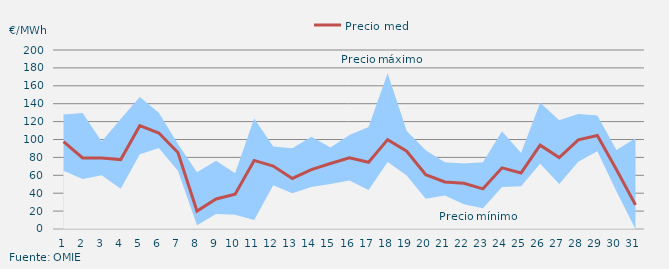
| Category | Precio medio |
|---|---|
| 1.0 | 97.749 |
| 2.0 | 79.348 |
| 3.0 | 79.367 |
| 4.0 | 77.556 |
| 5.0 | 115.408 |
| 6.0 | 107.266 |
| 7.0 | 85.431 |
| 8.0 | 20.031 |
| 9.0 | 33.573 |
| 10.0 | 38.955 |
| 11.0 | 76.627 |
| 12.0 | 70.354 |
| 13.0 | 56.496 |
| 14.0 | 66.403 |
| 15.0 | 73.223 |
| 16.0 | 79.601 |
| 17.0 | 74.549 |
| 18.0 | 99.835 |
| 19.0 | 86.894 |
| 20.0 | 60.642 |
| 21.0 | 52.532 |
| 22.0 | 51.056 |
| 23.0 | 44.871 |
| 24.0 | 68.318 |
| 25.0 | 62.602 |
| 26.0 | 93.675 |
| 27.0 | 79.762 |
| 28.0 | 99.619 |
| 29.0 | 104.475 |
| 30.0 | 66.494 |
| 31.0 | 26.913 |